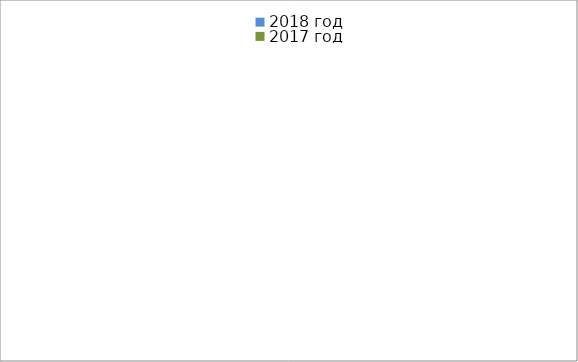
| Category | 2018 год | 2017 год |
|---|---|---|
|  - поджог | 14 | 19 |
|  - неосторожное обращение с огнём | 14 | 6 |
|  - НПТЭ электрооборудования | 17 | 25 |
|  - НПУ и Э печей | 61 | 52 |
|  - НПУ и Э транспортных средств | 43 | 45 |
|   -Шалость с огнем детей | 5 | 4 |
|  -НППБ при эксплуатации эл.приборов | 17 | 28 |
|  - курение | 30 | 37 |
| - прочие | 64 | 71 |
| - не установленные причины | 0 | 0 |